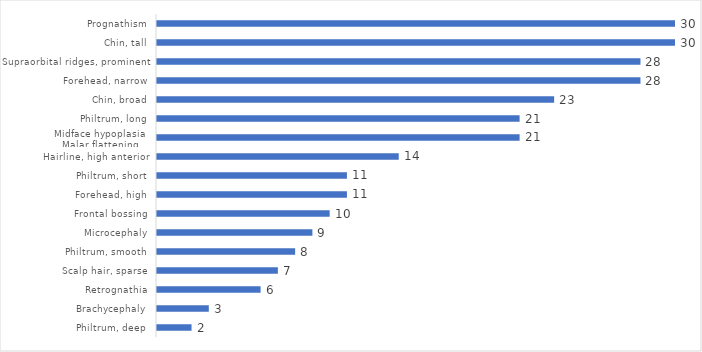
| Category | Series 0 |
|---|---|
| Philtrum, deep | 2 |
| Brachycephaly | 3 |
| Retrognathia | 6 |
| Scalp hair, sparse | 7 |
| Philtrum, smooth | 8 |
| Microcephaly | 9 |
| Frontal bossing | 10 |
| Forehead, high | 11 |
| Philtrum, short | 11 |
| Hairline, high anterior | 14 |
| Midface hypoplasia
Malar flattening | 21 |
| Philtrum, long | 21 |
| Chin, broad | 23 |
| Forehead, narrow | 28 |
| Supraorbital ridges, prominent | 28 |
| Chin, tall | 30 |
| Prognathism | 30 |